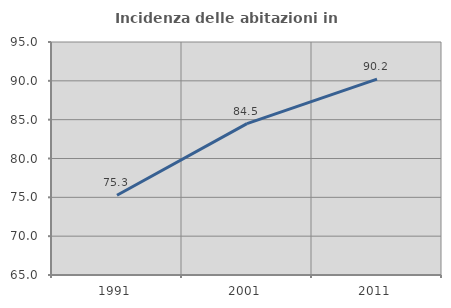
| Category | Incidenza delle abitazioni in proprietà  |
|---|---|
| 1991.0 | 75.269 |
| 2001.0 | 84.486 |
| 2011.0 | 90.221 |